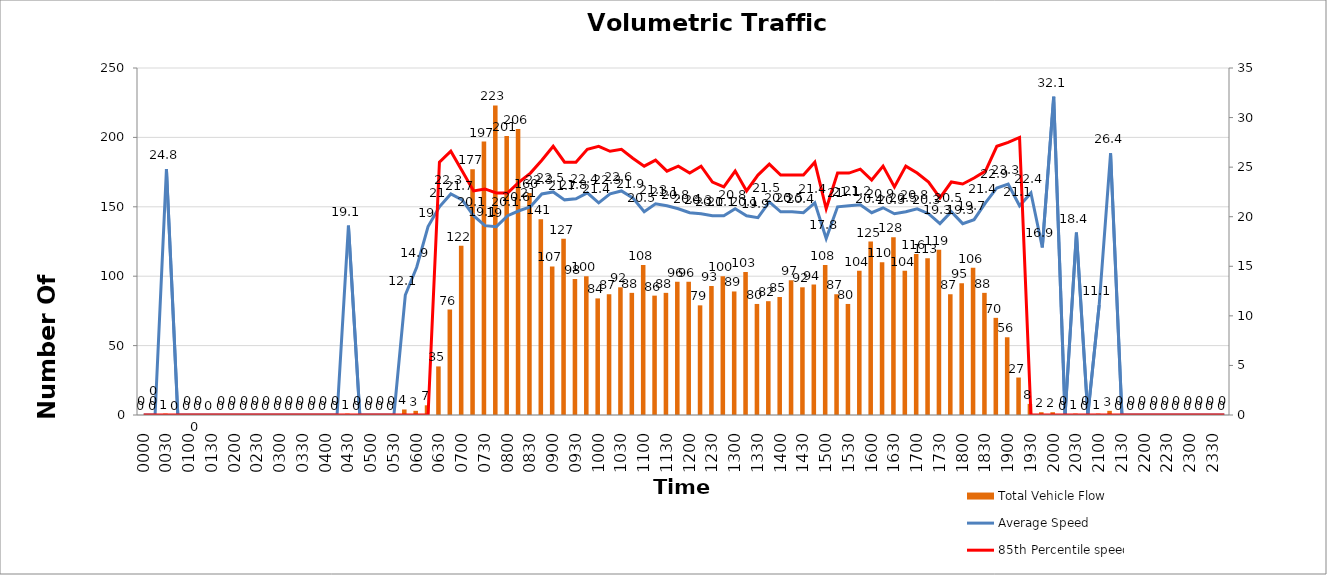
| Category | Total Vehicle Flow |
|---|---|
| 0000 | 0 |
| 0015 | 0 |
| 0030 | 1 |
| 0045 | 0 |
| 0100 | 0 |
| 0115 | 0 |
| 0130 | 0 |
| 0145 | 0 |
| 0200 | 0 |
| 0215 | 0 |
| 0230 | 0 |
| 0245 | 0 |
| 0300 | 0 |
| 0315 | 0 |
| 0330 | 0 |
| 0345 | 0 |
| 0400 | 0 |
| 0415 | 0 |
| 0430 | 1 |
| 0445 | 0 |
| 0500 | 0 |
| 0515 | 0 |
| 0530 | 0 |
| 0545 | 4 |
| 0600 | 3 |
| 0615 | 7 |
| 0630 | 35 |
| 0645 | 76 |
| 0700 | 122 |
| 0715 | 177 |
| 0730 | 197 |
| 0745 | 223 |
| 0800 | 201 |
| 0815 | 206 |
| 0830 | 160 |
| 0845 | 141 |
| 0900 | 107 |
| 0915 | 127 |
| 0930 | 98 |
| 0945 | 100 |
| 1000 | 84 |
| 1015 | 87 |
| 1030 | 92 |
| 1045 | 88 |
| 1100 | 108 |
| 1115 | 86 |
| 1130 | 88 |
| 1145 | 96 |
| 1200 | 96 |
| 1215 | 79 |
| 1230 | 93 |
| 1245 | 100 |
| 1300 | 89 |
| 1315 | 103 |
| 1330 | 80 |
| 1345 | 82 |
| 1400 | 85 |
| 1415 | 97 |
| 1430 | 92 |
| 1445 | 94 |
| 1500 | 108 |
| 1515 | 87 |
| 1530 | 80 |
| 1545 | 104 |
| 1600 | 125 |
| 1615 | 110 |
| 1630 | 128 |
| 1645 | 104 |
| 1700 | 116 |
| 1715 | 113 |
| 1730 | 119 |
| 1745 | 87 |
| 1800 | 95 |
| 1815 | 106 |
| 1830 | 88 |
| 1845 | 70 |
| 1900 | 56 |
| 1915 | 27 |
| 1930 | 8 |
| 1945 | 2 |
| 2000 | 2 |
| 2015 | 0 |
| 2030 | 1 |
| 2045 | 0 |
| 2100 | 1 |
| 2115 | 3 |
| 2130 | 0 |
| 2145 | 0 |
| 2200 | 0 |
| 2215 | 0 |
| 2230 | 0 |
| 2245 | 0 |
| 2300 | 0 |
| 2315 | 0 |
| 2330 | 0 |
| 2345 | 0 |